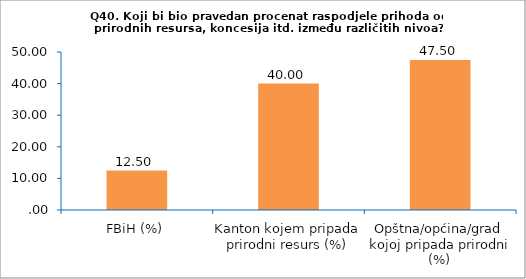
| Category | Series 0 |
|---|---|
| FBiH (%) | 12.5 |
| Kanton kojem pripada prirodni resurs (%) | 40 |
| Opštna/općina/grad kojoj pripada prirodni (%) | 47.5 |